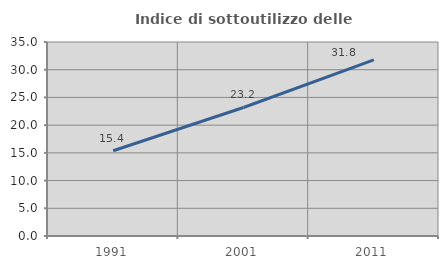
| Category | Indice di sottoutilizzo delle abitazioni  |
|---|---|
| 1991.0 | 15.375 |
| 2001.0 | 23.184 |
| 2011.0 | 31.786 |